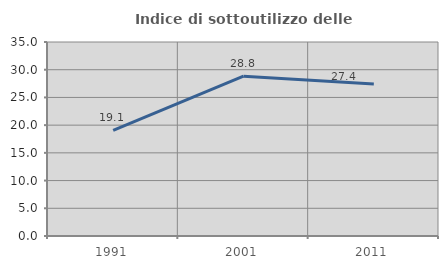
| Category | Indice di sottoutilizzo delle abitazioni  |
|---|---|
| 1991.0 | 19.074 |
| 2001.0 | 28.841 |
| 2011.0 | 27.434 |